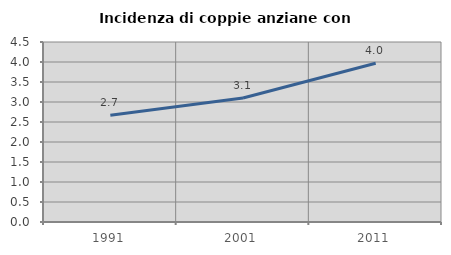
| Category | Incidenza di coppie anziane con figli |
|---|---|
| 1991.0 | 2.667 |
| 2001.0 | 3.101 |
| 2011.0 | 3.968 |